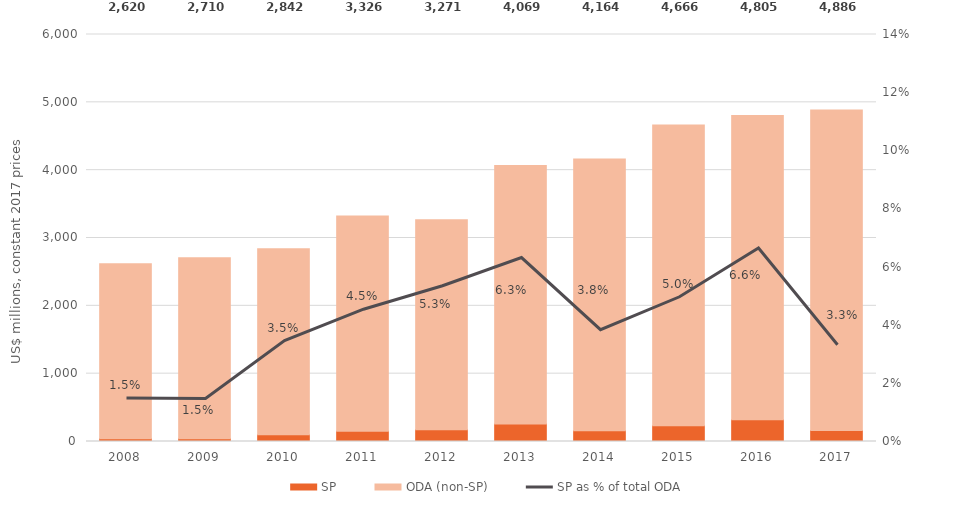
| Category | SP | ODA (non-SP) |
|---|---|---|
| 2008.0 | 38.856 | 2580.684 |
| 2009.0 | 39.728 | 2670.601 |
| 2010.0 | 98.21 | 2743.435 |
| 2011.0 | 150.768 | 3174.957 |
| 2012.0 | 174.716 | 3096.042 |
| 2013.0 | 256.765 | 3812.306 |
| 2014.0 | 159.48 | 4004.462 |
| 2015.0 | 231.475 | 4434.112 |
| 2016.0 | 319.131 | 4486.298 |
| 2017.0 | 161.838 | 4723.687 |